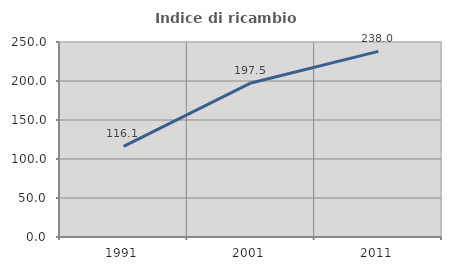
| Category | Indice di ricambio occupazionale  |
|---|---|
| 1991.0 | 116.139 |
| 2001.0 | 197.51 |
| 2011.0 | 237.991 |